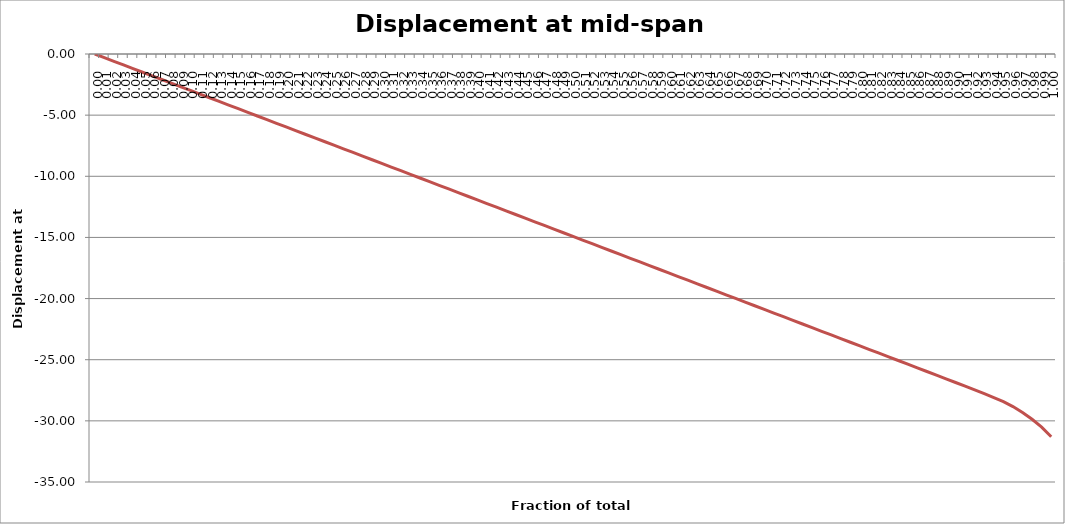
| Category | Displacement at mid-span [mm] |
|---|---|
| 0.0 | 0 |
| 0.01 | -0.298 |
| 0.02 | -0.596 |
| 0.03 | -0.894 |
| 0.04 | -1.192 |
| 0.05 | -1.491 |
| 0.06 | -1.789 |
| 0.06999999999999999 | -2.087 |
| 0.08 | -2.385 |
| 0.09 | -2.683 |
| 0.1 | -2.982 |
| 0.11000000000000001 | -3.28 |
| 0.12 | -3.578 |
| 0.13 | -3.876 |
| 0.13999999999999999 | -4.174 |
| 0.15 | -4.473 |
| 0.16 | -4.771 |
| 0.16999999999999998 | -5.069 |
| 0.18 | -5.367 |
| 0.19 | -5.666 |
| 0.2 | -5.964 |
| 0.21000000000000002 | -6.262 |
| 0.22000000000000003 | -6.56 |
| 0.22999999999999998 | -6.859 |
| 0.24 | -7.157 |
| 0.25 | -7.455 |
| 0.26 | -7.754 |
| 0.27 | -8.052 |
| 0.27999999999999997 | -8.35 |
| 0.29 | -8.648 |
| 0.3 | -8.947 |
| 0.31 | -9.245 |
| 0.32 | -9.543 |
| 0.32999999999999996 | -9.842 |
| 0.33999999999999997 | -10.14 |
| 0.35 | -10.438 |
| 0.36 | -10.737 |
| 0.37 | -11.035 |
| 0.38 | -11.334 |
| 0.39 | -11.632 |
| 0.4 | -11.93 |
| 0.41 | -12.229 |
| 0.42000000000000004 | -12.527 |
| 0.43 | -12.826 |
| 0.44000000000000006 | -13.124 |
| 0.45 | -13.422 |
| 0.45999999999999996 | -13.721 |
| 0.47000000000000003 | -14.019 |
| 0.48 | -14.318 |
| 0.49000000000000005 | -14.616 |
| 0.5 | -14.915 |
| 0.51 | -15.213 |
| 0.52 | -15.512 |
| 0.53 | -15.81 |
| 0.54 | -16.108 |
| 0.55 | -16.407 |
| 0.5599999999999999 | -16.705 |
| 0.5700000000000001 | -17.004 |
| 0.58 | -17.302 |
| 0.5900000000000001 | -17.601 |
| 0.6 | -17.9 |
| 0.61 | -18.198 |
| 0.62 | -18.497 |
| 0.63 | -18.795 |
| 0.64 | -19.094 |
| 0.65 | -19.392 |
| 0.6599999999999999 | -19.691 |
| 0.67 | -19.989 |
| 0.6799999999999999 | -20.288 |
| 0.6900000000000001 | -20.586 |
| 0.7 | -20.885 |
| 0.71 | -21.184 |
| 0.72 | -21.482 |
| 0.73 | -21.781 |
| 0.74 | -22.079 |
| 0.75 | -22.378 |
| 0.76 | -22.677 |
| 0.77 | -22.975 |
| 0.78 | -23.274 |
| 0.79 | -23.573 |
| 0.8 | -23.871 |
| 0.8099999999999999 | -24.17 |
| 0.82 | -24.469 |
| 0.8300000000000001 | -24.767 |
| 0.8400000000000001 | -25.066 |
| 0.85 | -25.365 |
| 0.86 | -25.664 |
| 0.8699999999999999 | -25.963 |
| 0.8800000000000001 | -26.263 |
| 0.89 | -26.563 |
| 0.9 | -26.864 |
| 0.9099999999999999 | -27.166 |
| 0.9199999999999999 | -27.471 |
| 0.93 | -27.779 |
| 0.9400000000000001 | -28.094 |
| 0.95 | -28.427 |
| 0.96 | -28.83 |
| 0.97 | -29.319 |
| 0.9800000000000001 | -29.872 |
| 0.99 | -30.509 |
| 1.0 | -31.303 |